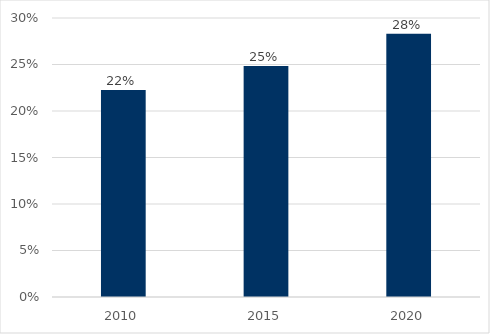
| Category | Liechtensteiner/innen mit mehreren Staatsangehörigkeiten |
|---|---|
| 2010.0 | 0.223 |
| 2015.0 | 0.248 |
| 2020.0 | 0.283 |